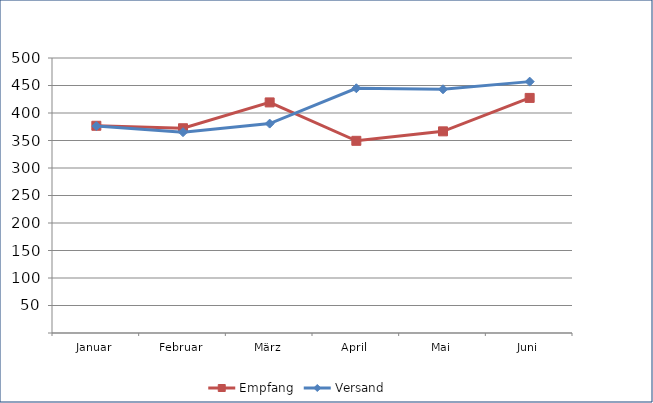
| Category | Empfang | Versand |
|---|---|---|
| Januar | 376.771 | 376.247 |
| Februar | 372.281 | 365.074 |
| März | 419.256 | 380.72 |
| April | 349.417 | 444.965 |
| Mai | 366.642 | 443.156 |
| Juni | 427.422 | 457.038 |